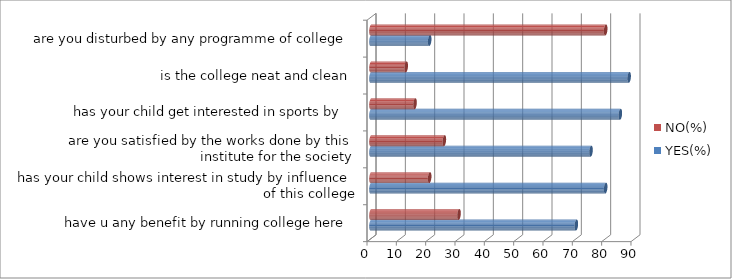
| Category | YES(%) | NO(%) |
|---|---|---|
| have u any benefit by running college here | 70 | 30 |
| has your child shows interest in study by influence of this college | 80 | 20 |
| are you satisfied by the works done by this institute for the society | 75 | 25 |
| has your child get interested in sports by  | 85 | 15 |
| is the college neat and clean | 88 | 12 |
| are you disturbed by any programme of college | 20 | 80 |